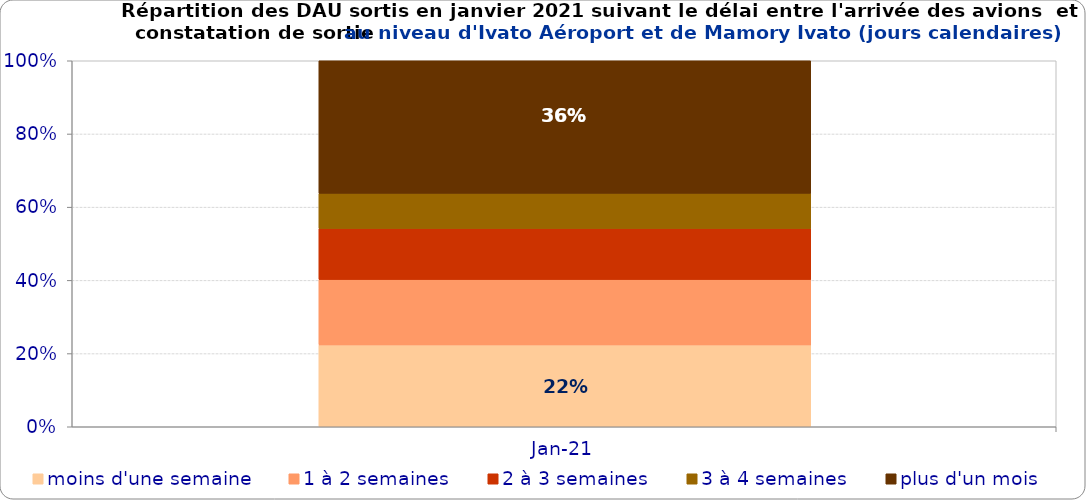
| Category | moins d'une semaine | 1 à 2 semaines | 2 à 3 semaines | 3 à 4 semaines | plus d'un mois |
|---|---|---|---|---|---|
| 2021-01-01 | 0.224 | 0.179 | 0.14 | 0.096 | 0.362 |